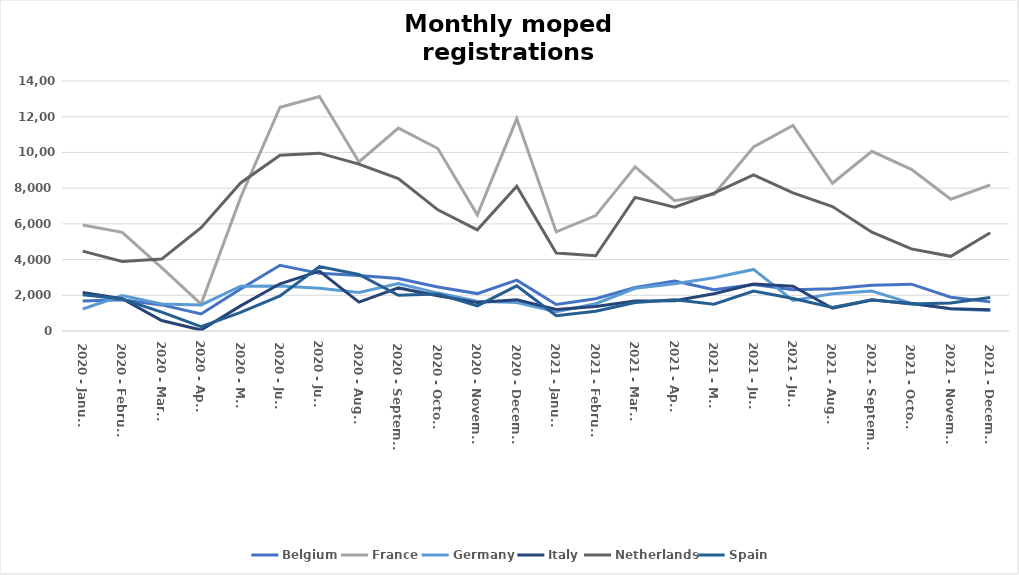
| Category | Belgium | France | Germany | Italy | Netherlands | Spain |
|---|---|---|---|---|---|---|
| 2020 - January | 1674 | 5931 | 1233 | 2158 | 4474 | 2034 |
| 2020 - February | 1743 | 5522 | 1982 | 1807 | 3898 | 1792 |
| 2020 - March | 1462 | 3555 | 1515 | 587 | 4029 | 1053 |
| 2020 - April | 953 | 1511 | 1462 | 55 | 5788 | 246 |
| 2020 - May | 2347 | 7467 | 2505 | 1408 | 8293 | 1048 |
| 2020 - June | 3681 | 12531 | 2517 | 2645 | 9847 | 1960 |
| 2020 - July | 3228 | 13133 | 2396 | 3352 | 9959 | 3604 |
| 2020 - August | 3104 | 9467 | 2163 | 1617 | 9348 | 3165 |
| 2020 - September | 2935 | 11362 | 2657 | 2413 | 8539 | 2004 |
| 2020 - October | 2464 | 10219 | 2123 | 1977 | 6786 | 2078 |
| 2020 - November | 2095 | 6503 | 1661 | 1590 | 5668 | 1409 |
| 2020 - December | 2849 | 11882 | 1591 | 1750 | 8106 | 2530 |
| 2021 - January | 1482 | 5551 | 1076 | 1205 | 4370 | 854 |
| 2021 - February | 1811 | 6462 | 1526 | 1368 | 4214 | 1104 |
| 2021 - March | 2432 | 9190 | 2393 | 1674 | 7481 | 1599 |
| 2021 - April | 2802 | 7298 | 2641 | 1700 | 6932 | 1752 |
| 2021 - May | 2309 | 7658 | 2979 | 2083 | 7715 | 1505 |
| 2021 - June | 2608 | 10307 | 3449 | 2627 | 8742 | 2237 |
| 2021 - July | 2314 | 11511 | 1711 | 2509 | 7739 | 1823 |
| 2021 - August | 2367 | 8273 | 2086 | 1274 | 6969 | 1312 |
| 2021 - September | 2564 | 10063 | 2239 | 1740 | 5532 | 1748 |
| 2021 - October | 2623 | 9053 | 1548 | 1537 | 4599 | 1516 |
| 2021 - November | 1889 | 7377 | 1232 | 1253 | 4181 | 1563 |
| 2021 - December | 1631 | 8186 | 1146 | 1192 | 5498 | 1873 |